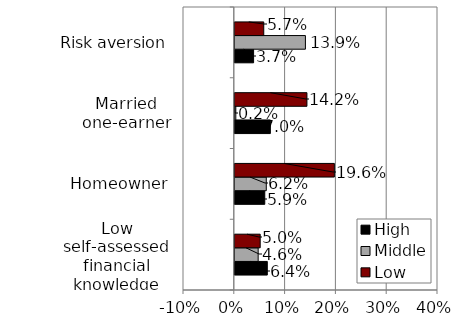
| Category | High | Middle | Low |
|---|---|---|---|
| Low self-assessed financial knowledge | 0.064 | 0.046 | 0.05 |
| Homeowner | 0.059 | 0.062 | 0.196 |
| Married one-earner | 0.07 | 0.002 | 0.142 |
| Risk aversion | 0.037 | 0.139 | 0.057 |